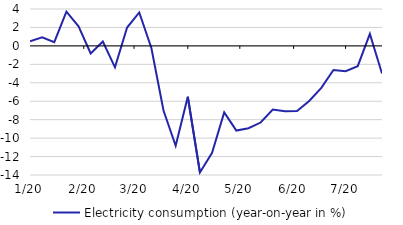
| Category | Electricity consumption (year-on-year in %) |
|---|---|
| 2020-01-06 | 0.501 |
| 2020-01-13 | 0.923 |
| 2020-01-20 | 0.402 |
| 2020-01-27 | 3.708 |
| 2020-02-03 | 2.115 |
| 2020-02-10 | -0.824 |
| 2020-02-17 | 0.475 |
| 2020-02-24 | -2.326 |
| 2020-03-02 | 1.993 |
| 2020-03-09 | 3.623 |
| 2020-03-16 | -0.23 |
| 2020-03-23 | -7.013 |
| 2020-03-30 | -10.83 |
| 2020-04-06 | -5.515 |
| 2020-04-13 | -13.719 |
| 2020-04-20 | -11.589 |
| 2020-04-27 | -7.208 |
| 2020-05-04 | -9.181 |
| 2020-05-11 | -8.929 |
| 2020-05-18 | -8.312 |
| 2020-05-25 | -6.901 |
| 2020-06-01 | -7.098 |
| 2020-06-08 | -7.053 |
| 2020-06-15 | -5.97 |
| 2020-06-22 | -4.551 |
| 2020-06-29 | -2.61 |
| 2020-07-06 | -2.748 |
| 2020-07-13 | -2.2 |
| 2020-07-20 | 1.3 |
| 2020-07-27 | -3 |